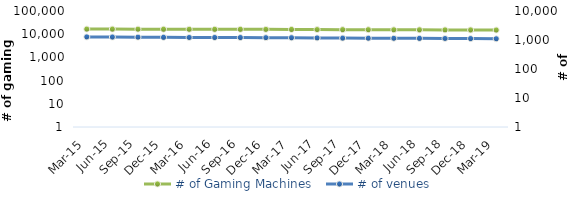
| Category | # of Gaming Machines  |
|---|---|
| Mar-15 | 16614 |
| Jun-15 | 16579 |
| Sep-15 | 16440 |
| Dec-15 | 16393 |
| Mar-16 | 16274 |
| Jun-16 | 16250 |
| Sep-16 | 16221 |
| Dec-16 | 16148 |
| Mar-17 | 16031 |
| Jun-17 | 15858 |
| Sep-17 | 15717 |
| Dec-17 | 15632 |
| Mar-18 | 15490 |
| Jun-18 | 15420 |
| Sep-18 | 15342 |
| Dec-18 | 15257 |
| Mar-19 | 15118 |